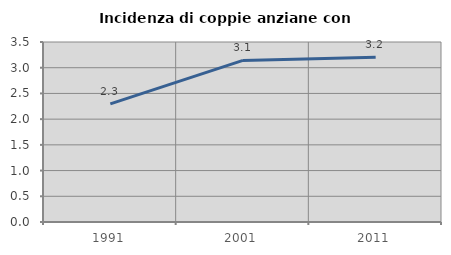
| Category | Incidenza di coppie anziane con figli |
|---|---|
| 1991.0 | 2.297 |
| 2001.0 | 3.141 |
| 2011.0 | 3.203 |